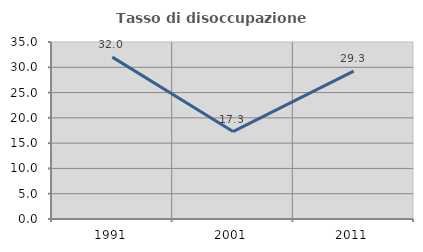
| Category | Tasso di disoccupazione giovanile  |
|---|---|
| 1991.0 | 32.01 |
| 2001.0 | 17.294 |
| 2011.0 | 29.254 |